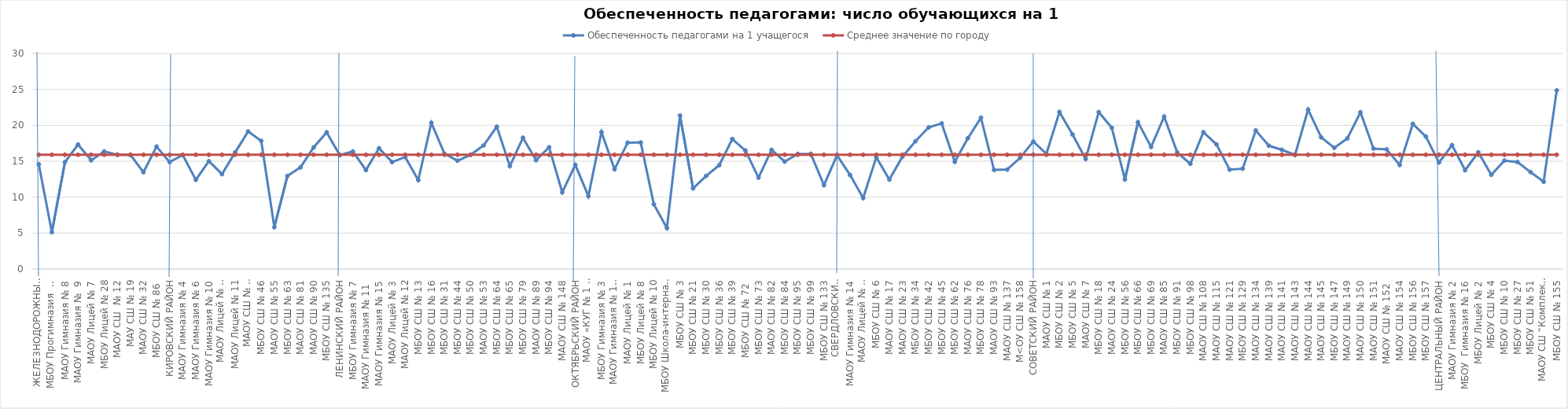
| Category | Обеспеченность педагогами на 1 учащегося | Среднее значение по городу |
|---|---|---|
| ЖЕЛЕЗНОДОРОЖНЫЙ РАЙОН | 14.568 | 15.905 |
| МБОУ Прогимназия  № 131 | 5.122 | 15.905 |
| МАОУ Гимназия № 8 | 14.875 | 15.905 |
| МАОУ Гимназия №  9 | 17.327 | 15.905 |
| МАОУ Лицей № 7 | 15.129 | 15.905 |
| МБОУ Лицей № 28 | 16.358 | 15.905 |
| МАОУ СШ  № 12 | 15.9 | 15.905 |
| МАУ СШ № 19 | 15.88 | 15.905 |
| МАОУ СШ № 32 | 13.481 | 15.905 |
| МБОУ СШ № 86  | 17.039 | 15.905 |
| КИРОВСКИЙ РАЙОН | 14.88 | 15.905 |
| МАОУ Гимназия № 4 | 15.879 | 15.905 |
| МАОУ Гимназия № 6 | 12.414 | 15.905 |
| МАОУ Гимназия № 10 | 15.014 | 15.905 |
| МАОУ Лицей № 6 "Перспектива" | 13.201 | 15.905 |
| МАОУ Лицей № 11 | 16.216 | 15.905 |
| МАОУ СШ № 8 "Созидание" | 19.145 | 15.905 |
| МБОУ СШ № 46 | 17.828 | 15.905 |
| МАОУ СШ № 55 | 5.821 | 15.905 |
| МБОУ СШ № 63 | 12.955 | 15.905 |
| МАОУ СШ № 81 | 14.147 | 15.905 |
| МАОУ СШ № 90 | 16.919 | 15.905 |
| МБОУ СШ № 135 | 19.024 | 15.905 |
| ЛЕНИНСКИЙ РАЙОН | 15.854 | 15.905 |
| МБОУ Гимназия № 7 | 16.361 | 15.905 |
| МАОУ Гимназия № 11  | 13.773 | 15.905 |
| МАОУ Гимназия № 15 | 16.802 | 15.905 |
| МАОУ Лицей № 3 | 14.879 | 15.905 |
| МАОУ Лицей № 12 | 15.585 | 15.905 |
| МБОУ СШ № 13 | 12.383 | 15.905 |
| МБОУ СШ № 16 | 20.344 | 15.905 |
| МБОУ СШ № 31 | 16.049 | 15.905 |
| МБОУ СШ № 44 | 15.07 | 15.905 |
| МБОУ СШ № 50 | 15.895 | 15.905 |
| МАОУ СШ № 53 | 17.211 | 15.905 |
| МБОУ СШ № 64 | 19.804 | 15.905 |
| МБОУ СШ № 65 | 14.324 | 15.905 |
| МБОУ СШ № 79 | 18.268 | 15.905 |
| МАОУ СШ № 89 | 15.146 | 15.905 |
| МБОУ СШ № 94 | 16.944 | 15.905 |
| МАОУ СШ № 148 | 10.672 | 15.905 |
| ОКТЯБРЬСКИЙ РАЙОН | 14.502 | 15.905 |
| МАОУ «КУГ № 1 – Универс» | 10.145 | 15.905 |
| МБОУ Гимназия № 3 | 19.056 | 15.905 |
| МАОУ Гимназия № 13 "Академ" | 13.889 | 15.905 |
| МАОУ Лицей № 1 | 17.582 | 15.905 |
| МБОУ Лицей № 8 | 17.617 | 15.905 |
| МБОУ Лицей № 10 | 9.016 | 15.905 |
| МБОУ Школа-интернат № 1 | 5.697 | 15.905 |
| МБОУ СШ № 3 | 21.353 | 15.905 |
| МБОУ СШ № 21 | 11.217 | 15.905 |
| МБОУ СШ № 30 | 12.96 | 15.905 |
| МБОУ СШ № 36 | 14.457 | 15.905 |
| МБОУ СШ № 39 | 18.088 | 15.905 |
| МБОУ СШ № 72  | 16.493 | 15.905 |
| МБОУ СШ № 73 | 12.714 | 15.905 |
| МАОУ СШ № 82 | 16.582 | 15.905 |
| МБОУ СШ № 84 | 14.95 | 15.905 |
| МБОУ СШ № 95 | 16.015 | 15.905 |
| МБОУ СШ № 99 | 16.025 | 15.905 |
| МБОУ СШ № 133 | 11.677 | 15.905 |
| СВЕРДЛОВСКИЙ РАЙОН | 15.833 | 15.905 |
| МАОУ Гимназия № 14 | 13.078 | 15.905 |
| МАОУ Лицей № 9 "Лидер" | 9.873 | 15.905 |
| МБОУ СШ № 6 | 15.558 | 15.905 |
| МАОУ СШ № 17 | 12.455 | 15.905 |
| МАОУ СШ № 23 | 15.635 | 15.905 |
| МБОУ СШ № 34 | 17.789 | 15.905 |
| МБОУ СШ № 42 | 19.7 | 15.905 |
| МБОУ СШ № 45 | 20.266 | 15.905 |
| МБОУ СШ № 62 | 14.918 | 15.905 |
| МАОУ СШ № 76 | 18.212 | 15.905 |
| МБОУ СШ № 78 | 21.056 | 15.905 |
| МАОУ СШ № 93 | 13.787 | 15.905 |
| МАОУ СШ № 137 | 13.838 | 15.905 |
| М<ОУ СШ № 158 | 15.493 | 15.905 |
| СОВЕТСКИЙ РАЙОН | 17.746 | 15.905 |
| МАОУ СШ № 1 | 16.033 | 15.905 |
| МБОУ СШ № 2 | 21.857 | 15.905 |
| МБОУ СШ № 5 | 18.724 | 15.905 |
| МАОУ СШ № 7 | 15.312 | 15.905 |
| МБОУ СШ № 18 | 21.847 | 15.905 |
| МАОУ СШ № 24 | 19.648 | 15.905 |
| МБОУ СШ № 56 | 12.463 | 15.905 |
| МБОУ СШ № 66 | 20.429 | 15.905 |
| МБОУ СШ № 69 | 17 | 15.905 |
| МАОУ СШ № 85 | 21.211 | 15.905 |
| МБОУ СШ № 91 | 16.22 | 15.905 |
| МБОУ СШ № 98 | 14.644 | 15.905 |
| МАОУ СШ № 108 | 19.036 | 15.905 |
| МАОУ СШ № 115 | 17.344 | 15.905 |
| МАОУ СШ № 121 | 13.833 | 15.905 |
| МБОУ СШ № 129 | 13.966 | 15.905 |
| МАОУ СШ № 134 | 19.284 | 15.905 |
| МАОУ СШ № 139 | 17.158 | 15.905 |
| МАОУ СШ № 141 | 16.587 | 15.905 |
| МАОУ СШ № 143 | 15.876 | 15.905 |
| МАОУ СШ № 144 | 22.192 | 15.905 |
| МАОУ СШ № 145 | 18.33 | 15.905 |
| МБОУ СШ № 147 | 16.87 | 15.905 |
| МАОУ СШ № 149 | 18.18 | 15.905 |
| МАОУ СШ № 150 | 21.81 | 15.905 |
| МАОУ СШ № 151 | 16.757 | 15.905 |
| МАОУ СШ № 152  | 16.659 | 15.905 |
| МАОУ СШ № 154 | 14.477 | 15.905 |
| МБОУ СШ № 156 | 20.204 | 15.905 |
| МБОУ СШ № 157 | 18.439 | 15.905 |
| ЦЕНТРАЛЬНЫЙ РАЙОН | 14.83 | 15.905 |
| МАОУ Гимназия № 2 | 17.242 | 15.905 |
| МБОУ  Гимназия № 16 | 13.746 | 15.905 |
| МБОУ Лицей № 2 | 16.25 | 15.905 |
| МБОУ СШ № 4 | 13.109 | 15.905 |
| МБОУ СШ № 10 | 15.087 | 15.905 |
| МБОУ СШ № 27 | 14.891 | 15.905 |
| МБОУ СШ № 51 | 13.485 | 15.905 |
| МАОУ СШ "Комплекс "Покровский" | 12.156 | 15.905 |
| МБОУ СШ № 155 | 24.867 | 15.905 |